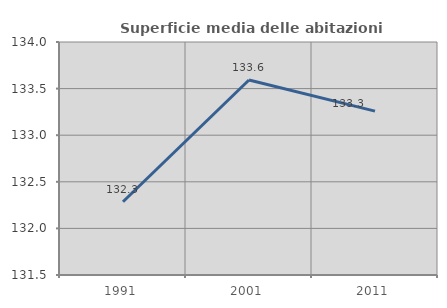
| Category | Superficie media delle abitazioni occupate |
|---|---|
| 1991.0 | 132.286 |
| 2001.0 | 133.593 |
| 2011.0 | 133.259 |